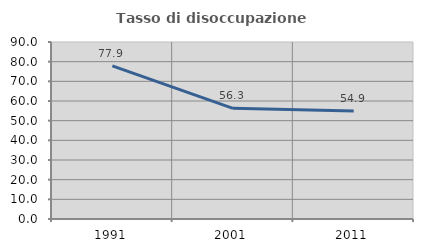
| Category | Tasso di disoccupazione giovanile  |
|---|---|
| 1991.0 | 77.892 |
| 2001.0 | 56.287 |
| 2011.0 | 54.861 |